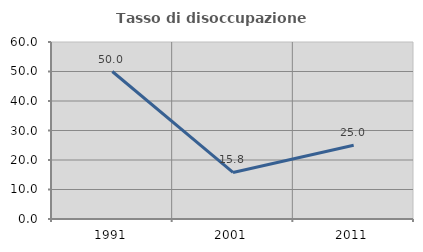
| Category | Tasso di disoccupazione giovanile  |
|---|---|
| 1991.0 | 50 |
| 2001.0 | 15.789 |
| 2011.0 | 25 |